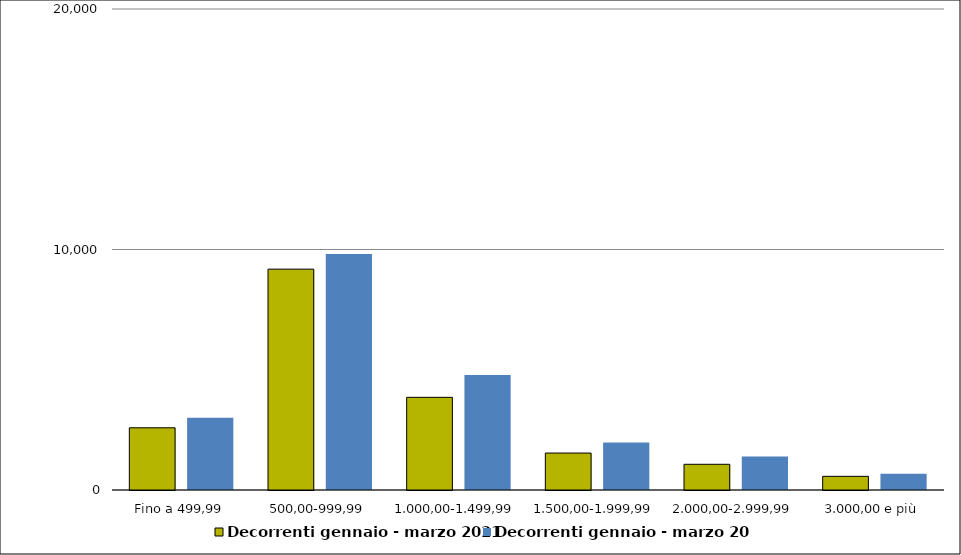
| Category | Decorrenti gennaio - marzo 2021 | Decorrenti gennaio - marzo 2020 |
|---|---|---|
| Fino a 499,99 | 2587 | 3004 |
| 500,00-999,99 | 9183 | 9812 |
| 1.000,00-1.499,99 | 3853 | 4781 |
| 1.500,00-1.999,99 | 1536 | 1980 |
| 2.000,00-2.999,99 | 1069 | 1388 |
| 3.000,00 e più | 568 | 677 |